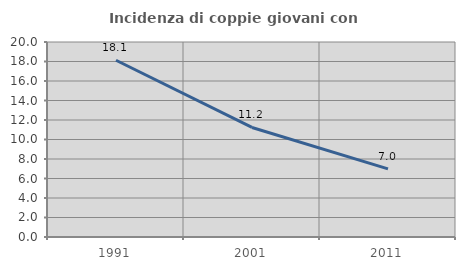
| Category | Incidenza di coppie giovani con figli |
|---|---|
| 1991.0 | 18.13 |
| 2001.0 | 11.236 |
| 2011.0 | 6.986 |